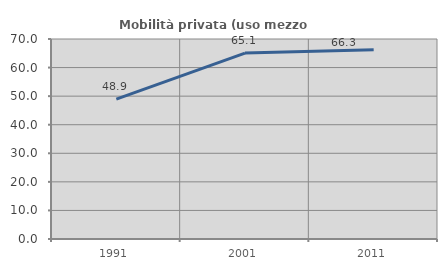
| Category | Mobilità privata (uso mezzo privato) |
|---|---|
| 1991.0 | 48.93 |
| 2001.0 | 65.079 |
| 2011.0 | 66.254 |